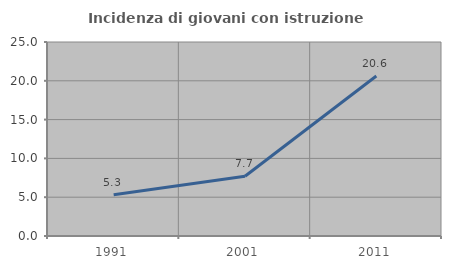
| Category | Incidenza di giovani con istruzione universitaria |
|---|---|
| 1991.0 | 5.31 |
| 2001.0 | 7.692 |
| 2011.0 | 20.619 |